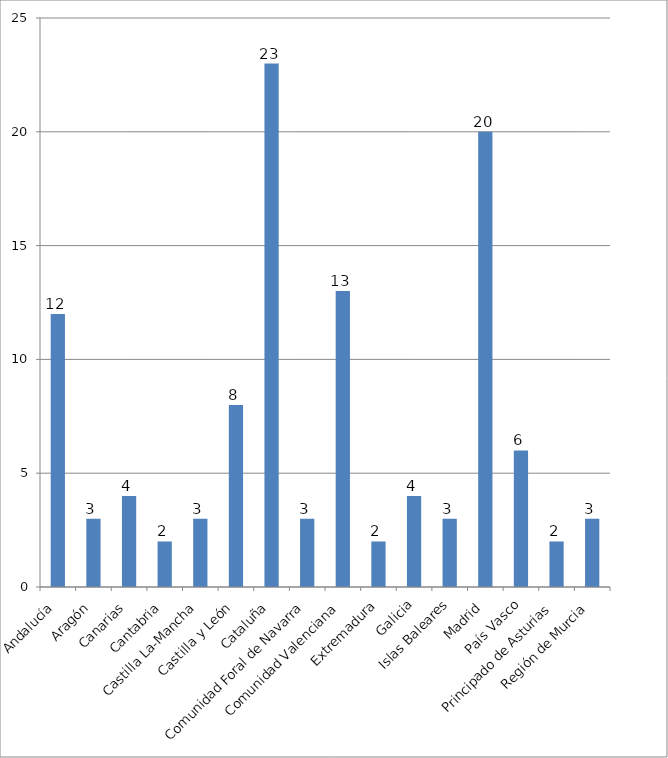
| Category | Total |
|---|---|
| Andalucía | 12 |
| Aragón | 3 |
| Canarias | 4 |
| Cantabria | 2 |
| Castilla La-Mancha | 3 |
| Castilla y León | 8 |
| Cataluña | 23 |
| Comunidad Foral de Navarra | 3 |
| Comunidad Valenciana | 13 |
| Extremadura | 2 |
| Galicia | 4 |
| Islas Baleares | 3 |
| Madrid | 20 |
| País Vasco | 6 |
| Principado de Asturias | 2 |
| Región de Murcia | 3 |